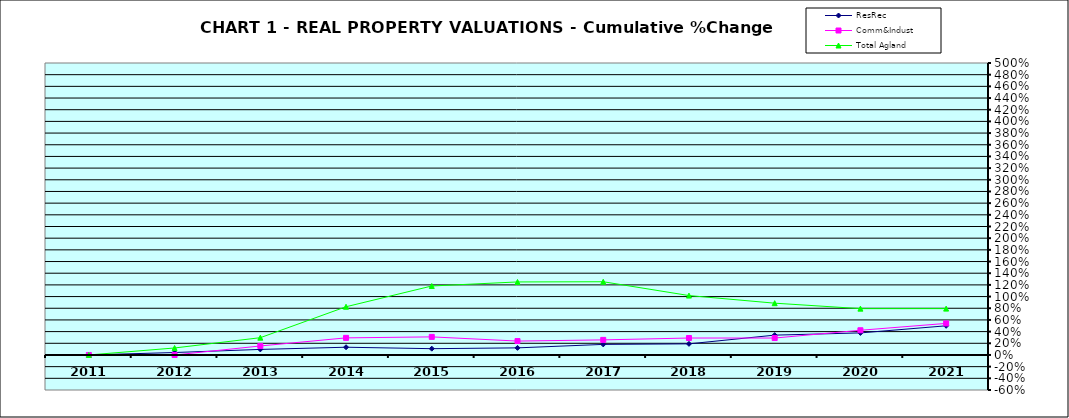
| Category | ResRec | Comm&Indust | Total Agland |
|---|---|---|---|
| 2011.0 | 0 | 0 | 0 |
| 2012.0 | 0.042 | 0 | 0.12 |
| 2013.0 | 0.095 | 0.154 | 0.296 |
| 2014.0 | 0.132 | 0.293 | 0.826 |
| 2015.0 | 0.108 | 0.31 | 1.181 |
| 2016.0 | 0.122 | 0.238 | 1.25 |
| 2017.0 | 0.181 | 0.258 | 1.254 |
| 2018.0 | 0.19 | 0.29 | 1.017 |
| 2019.0 | 0.34 | 0.29 | 0.887 |
| 2020.0 | 0.378 | 0.423 | 0.793 |
| 2021.0 | 0.499 | 0.54 | 0.794 |